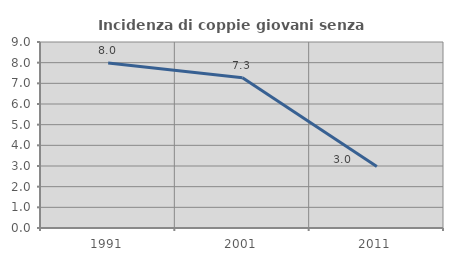
| Category | Incidenza di coppie giovani senza figli |
|---|---|
| 1991.0 | 7.986 |
| 2001.0 | 7.273 |
| 2011.0 | 2.982 |